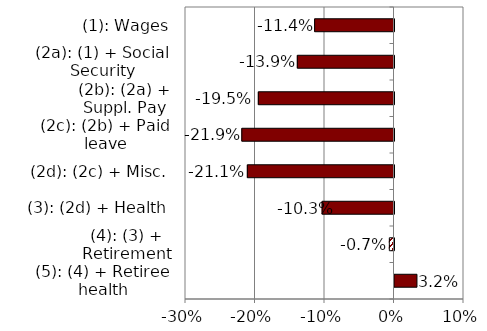
| Category | Series 0 |
|---|---|
| (5): (4) + Retiree health | 0.032 |
| (4): (3) + Retirement | -0.007 |
| (3): (2d) + Health | -0.103 |
| (2d): (2c) + Misc. | -0.211 |
| (2c): (2b) + Paid leave | -0.219 |
| (2b): (2a) + Suppl. Pay | -0.195 |
| (2a): (1) + Social Security | -0.139 |
| (1): Wages | -0.114 |